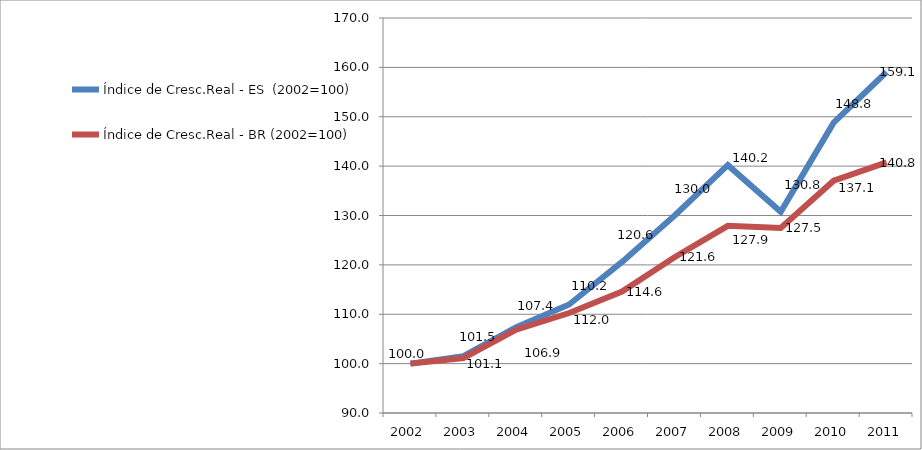
| Category | Índice de Cresc.Real - ES  (2002=100) | Índice de Cresc.Real - BR (2002=100) |
|---|---|---|
| 2002.0 | 100 | 100 |
| 2003.0 | 101.507 | 101.147 |
| 2004.0 | 107.369 | 106.868 |
| 2005.0 | 111.974 | 110.244 |
| 2006.0 | 120.591 | 114.607 |
| 2007.0 | 130.048 | 121.588 |
| 2008.0 | 140.192 | 127.911 |
| 2009.0 | 130.755 | 127.489 |
| 2010.0 | 148.799 | 137.05 |
| 2011.0 | 159.067 | 140.751 |